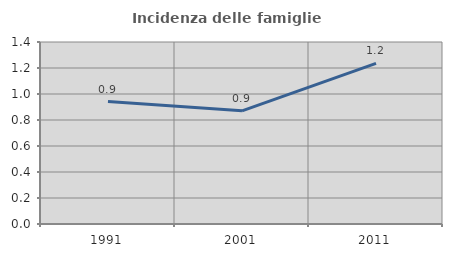
| Category | Incidenza delle famiglie numerose |
|---|---|
| 1991.0 | 0.941 |
| 2001.0 | 0.87 |
| 2011.0 | 1.235 |